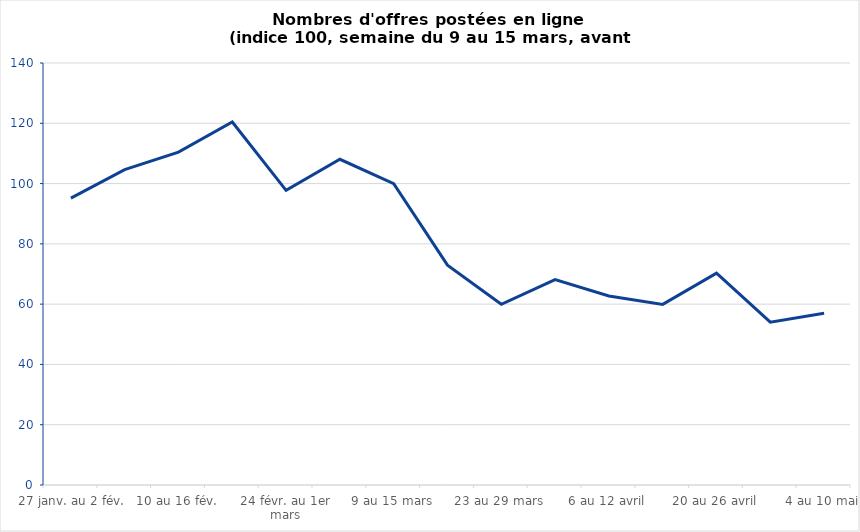
| Category | Series 0 |
|---|---|
| 27 janv. au 2 fév. | 95.185 |
| 3 au 9 fév. | 104.648 |
| 10 au 16 fév. | 110.442 |
| 17 au 23 fév. | 120.431 |
| 24 févr. au 1er mars | 97.757 |
| 2 au 8 mars | 108.052 |
| 9 au 15 mars | 100 |
| 16 au 22 mars | 72.925 |
| 23 au 29 mars | 59.965 |
| 30 mars au 5 avril | 68.123 |
| 6 au 12 avril | 62.691 |
| 13 au 19 avril | 59.916 |
| 20 au 26 avril | 70.272 |
| 27 avril au 3 mai | 54 |
| 4 au 10 mai | 57 |